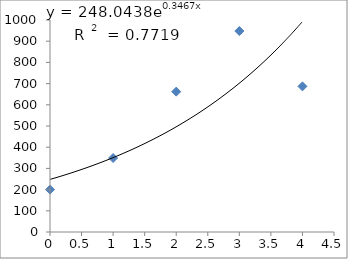
| Category | Series 0 |
|---|---|
| 0.0 | 200 |
| 1.0 | 349 |
| 2.0 | 662 |
| 3.0 | 948 |
| 4.0 | 687 |